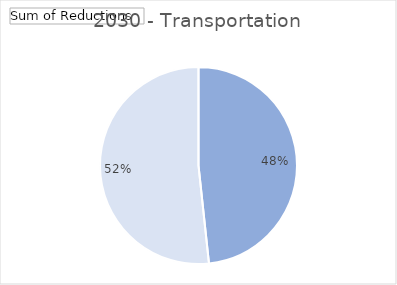
| Category | 2030 |
|---|---|
| 0 | 0.483 |
| 1 | 0.517 |